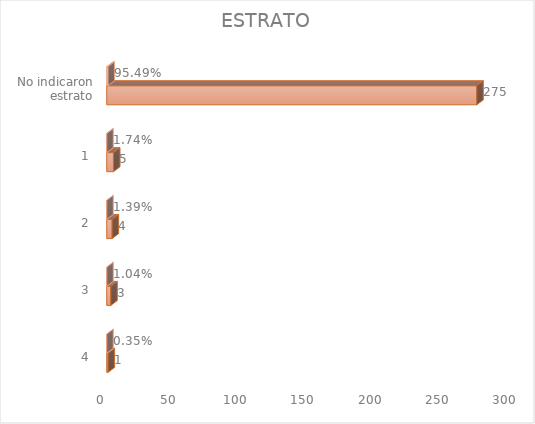
| Category | Cuenta de Número petición | Cuenta de Número petición2 |
|---|---|---|
| 4 | 1 | 0.003 |
| 3 | 3 | 0.01 |
| 2 | 4 | 0.014 |
| 1 | 5 | 0.017 |
| No indicaron estrato | 275 | 0.955 |